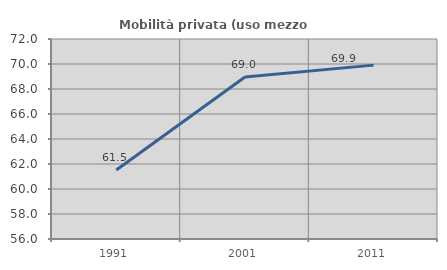
| Category | Mobilità privata (uso mezzo privato) |
|---|---|
| 1991.0 | 61.515 |
| 2001.0 | 68.96 |
| 2011.0 | 69.91 |